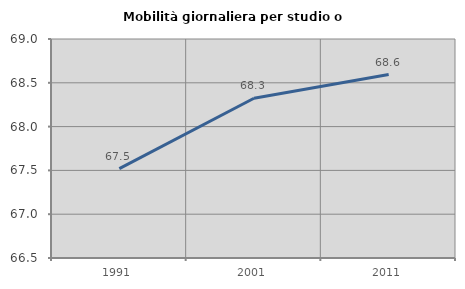
| Category | Mobilità giornaliera per studio o lavoro |
|---|---|
| 1991.0 | 67.52 |
| 2001.0 | 68.324 |
| 2011.0 | 68.594 |